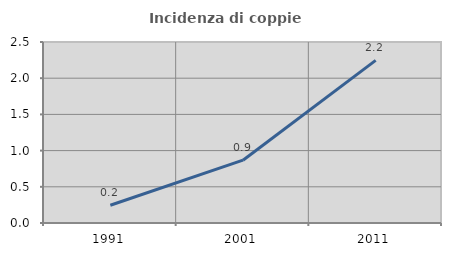
| Category | Incidenza di coppie miste |
|---|---|
| 1991.0 | 0.245 |
| 2001.0 | 0.868 |
| 2011.0 | 2.246 |